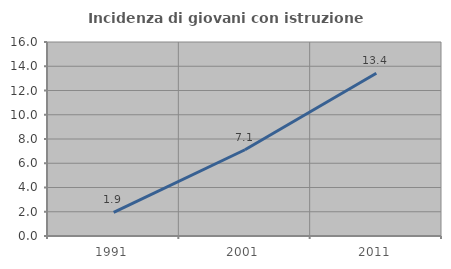
| Category | Incidenza di giovani con istruzione universitaria |
|---|---|
| 1991.0 | 1.945 |
| 2001.0 | 7.112 |
| 2011.0 | 13.422 |